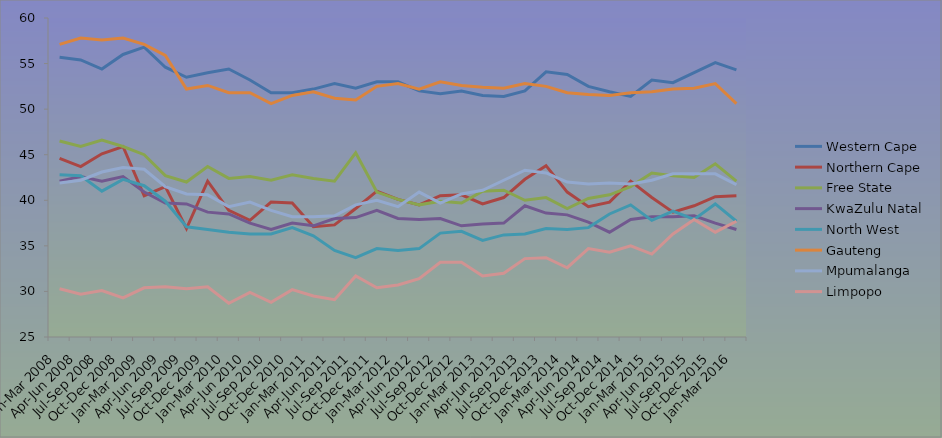
| Category | Western Cape | Northern Cape | Free State | KwaZulu Natal | North West | Gauteng | Mpumalanga | Limpopo |
|---|---|---|---|---|---|---|---|---|
| Jan-Mar 2008 | 55.7 | 44.6 | 46.5 | 42.1 | 42.8 | 57.1 | 41.9 | 30.3 |
| Apr-Jun 2008 | 55.4 | 43.7 | 45.9 | 42.6 | 42.7 | 57.8 | 42.2 | 29.7 |
| Jul-Sep 2008 | 54.4 | 45.1 | 46.6 | 42.1 | 41 | 57.6 | 43.1 | 30.1 |
| Oct-Dec 2008 | 56 | 45.9 | 45.9 | 42.6 | 42.3 | 57.8 | 43.6 | 29.3 |
| Jan-Mar 2009 | 56.8 | 40.5 | 45 | 40.9 | 41.6 | 57.1 | 43.4 | 30.4 |
| Apr-Jun 2009 | 54.6 | 41.5 | 42.7 | 39.7 | 39.9 | 55.9 | 41.5 | 30.5 |
| Jul-Sep 2009 | 53.5 | 36.9 | 42 | 39.6 | 37.1 | 52.2 | 40.7 | 30.3 |
| Oct-Dec 2009 | 54 | 42.1 | 43.7 | 38.7 | 36.8 | 52.6 | 40.6 | 30.5 |
| Jan-Mar 2010 | 54.4 | 38.9 | 42.4 | 38.5 | 36.5 | 51.8 | 39.3 | 28.7 |
| Apr-Jun 2010 | 53.2 | 37.8 | 42.6 | 37.5 | 36.3 | 51.8 | 39.8 | 29.9 |
| Jul-Sep 2010 | 51.8 | 39.8 | 42.2 | 36.8 | 36.3 | 50.6 | 38.9 | 28.8 |
| Oct-Dec 2010 | 51.8 | 39.7 | 42.8 | 37.5 | 37 | 51.5 | 38.2 | 30.2 |
| Jan-Mar 2011 | 52.2 | 37.1 | 42.4 | 37.2 | 36.1 | 51.9 | 38.2 | 29.5 |
| Apr-Jun 2011 | 52.8 | 37.3 | 42.1 | 38 | 34.5 | 51.2 | 38.3 | 29.1 |
| Jul-Sep 2011 | 52.3 | 39.1 | 45.2 | 38.1 | 33.7 | 51 | 39.5 | 31.7 |
| Oct-Dec 2011 | 53 | 41 | 40.9 | 38.9 | 34.7 | 52.5 | 40 | 30.4 |
| Jan-Mar 2012 | 53 | 40.1 | 40.1 | 38 | 34.5 | 52.8 | 39.3 | 30.7 |
| Apr-Jun 2012 | 52 | 39.5 | 39.5 | 37.9 | 34.7 | 52.2 | 40.9 | 31.4 |
| Jul-Sep 2012 | 51.7 | 40.5 | 39.9 | 38 | 36.4 | 53 | 39.7 | 33.2 |
| Oct-Dec 2012 | 52 | 40.6 | 39.7 | 37.2 | 36.6 | 52.6 | 40.7 | 33.2 |
| Jan-Mar 2013 | 51.5 | 39.6 | 41 | 37.4 | 35.6 | 52.4 | 41.1 | 31.7 |
| Apr-Jun 2013 | 51.4 | 40.3 | 41.1 | 37.5 | 36.2 | 52.3 | 42.2 | 32 |
| Jul-Sep 2013 | 52 | 42.3 | 40 | 39.4 | 36.3 | 52.8 | 43.3 | 33.6 |
| Oct-Dec 2013 | 54.1 | 43.8 | 40.3 | 38.6 | 36.9 | 52.5 | 43 | 33.7 |
| Jan-Mar 2014 | 53.8 | 40.9 | 39.1 | 38.4 | 36.8 | 51.8 | 42 | 32.6 |
| Apr-Jun 2014 | 52.5 | 39.3 | 40.2 | 37.6 | 37 | 51.6 | 41.8 | 34.7 |
| Jul-Sep 2014 | 51.9 | 39.8 | 40.6 | 36.5 | 38.5 | 51.5 | 41.9 | 34.3 |
| Oct-Dec 2014 | 51.4 | 42.1 | 41.5 | 37.9 | 39.5 | 51.8 | 41.8 | 35 |
| Jan-Mar 2015 | 53.2 | 40.3 | 43 | 38.2 | 37.8 | 51.9 | 42.2 | 34.1 |
| Apr-Jun 2015 | 52.9 | 38.7 | 42.7 | 38.2 | 38.8 | 52.2 | 42.9 | 36.3 |
| Jul-Sep 2015 | 54 | 39.4 | 42.5 | 38.3 | 37.9 | 52.3 | 42.9 | 37.9 |
| Oct-Dec 2015 | 55.1 | 40.4 | 44 | 37.5 | 39.6 | 52.8 | 42.9 | 36.5 |
| Jan-Mar 2016 | 54.3 | 40.5 | 42.1 | 36.8 | 37.7 | 50.6 | 41.7 | 37.7 |